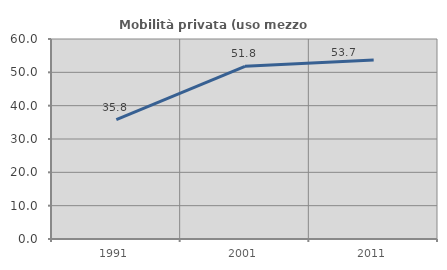
| Category | Mobilità privata (uso mezzo privato) |
|---|---|
| 1991.0 | 35.787 |
| 2001.0 | 51.807 |
| 2011.0 | 53.725 |